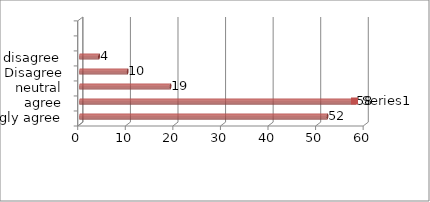
| Category | Series 0 |
|---|---|
| strongly agree | 52 |
| agree | 58 |
| neutral | 19 |
| Disagree | 10 |
| Strongly disagree | 4 |